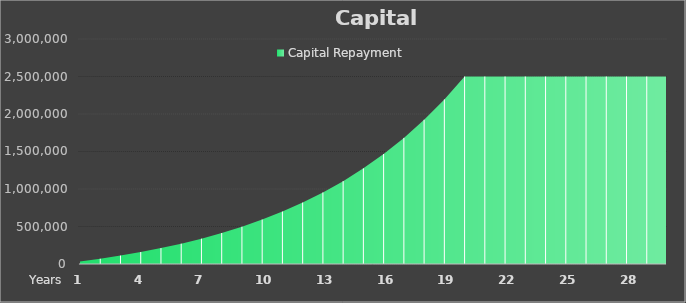
| Category | Capital Repayment |
|---|---|
| 0 | 33107.46 |
| 1 | 70321.536 |
| 2 | 112151.611 |
| 3 | 159170.246 |
| 4 | 212021.028 |
| 5 | 271427.368 |
| 6 | 338202.413 |
| 7 | 413260.169 |
| 8 | 497628.016 |
| 9 | 592460.768 |
| 10 | 699056.481 |
| 11 | 818874.223 |
| 12 | 953554.04 |
| 13 | 1104939.41 |
| 14 | 1275102.473 |
| 15 | 1466372.395 |
| 16 | 1681367.252 |
| 17 | 1923029.86 |
| 18 | 2194668.062 |
| 19 | 2500000 |
| 20 | 2500000 |
| 21 | 2500000 |
| 22 | 2500000 |
| 23 | 2500000 |
| 24 | 2500000 |
| 25 | 2500000 |
| 26 | 2500000 |
| 27 | 2500000 |
| 28 | 2500000 |
| 29 | 2500000 |